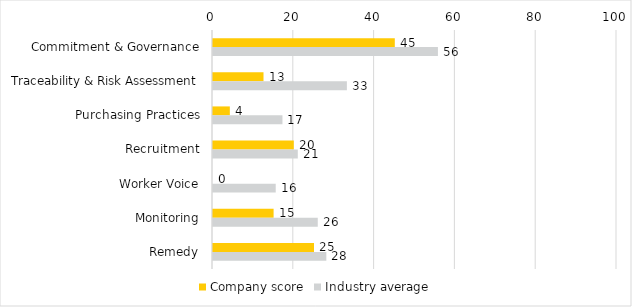
| Category | Company score | Industry average |
|---|---|---|
| Commitment & Governance | 45 | 55.674 |
| Traceability & Risk Assessment | 12.5 | 33.14 |
| Purchasing Practices | 4.167 | 17.19 |
| Recruitment | 20 | 20.988 |
| Worker Voice | 0 | 15.523 |
| Monitoring | 15 | 25.93 |
| Remedy | 25 | 28.052 |